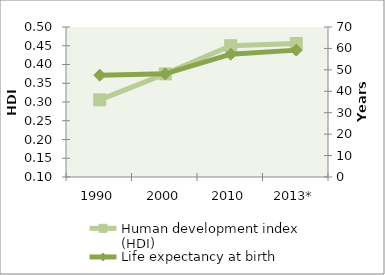
| Category | Human development index (HDI) |
|---|---|
| 1990 | 0.306 |
| 2000 | 0.375 |
| 2010 | 0.45 |
| 2013* | 0.456 |